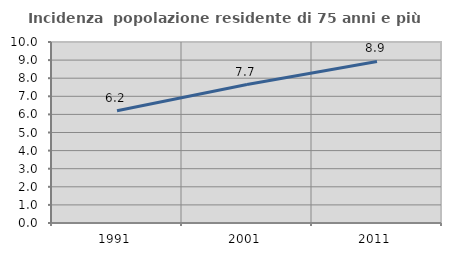
| Category | Incidenza  popolazione residente di 75 anni e più |
|---|---|
| 1991.0 | 6.206 |
| 2001.0 | 7.651 |
| 2011.0 | 8.925 |